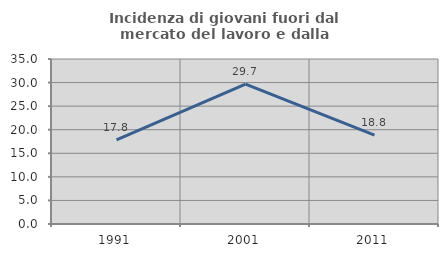
| Category | Incidenza di giovani fuori dal mercato del lavoro e dalla formazione  |
|---|---|
| 1991.0 | 17.838 |
| 2001.0 | 29.661 |
| 2011.0 | 18.841 |